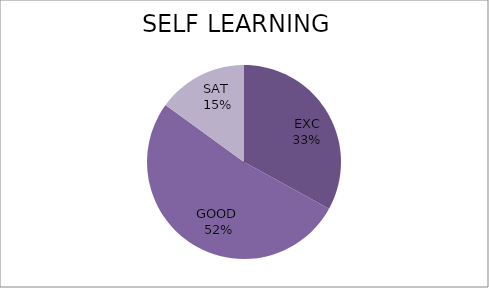
| Category | Series 0 |
|---|---|
| EXC | 33 |
| GOOD  | 52 |
| SAT  | 15 |